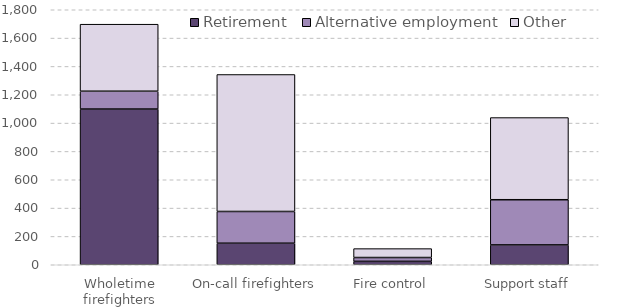
| Category | Retirement | Alternative employment | Other |
|---|---|---|---|
| Wholetime firefighters | 1099 | 126 | 473 |
| On-call firefighters | 152 | 224 | 967 |
| Fire control | 24 | 27 | 63 |
| Support staff | 140 | 319 | 580 |